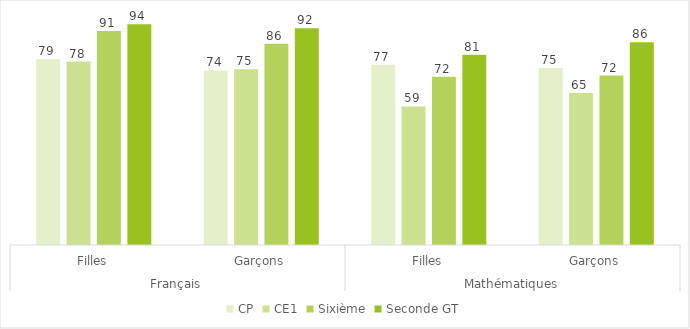
| Category | CP | CE1 | Sixième | Seconde GT |
|---|---|---|---|---|
| 0 | 79.086 | 78.06 | 91.1 | 93.9 |
| 1 | 74.3 | 74.739 | 85.65 | 92.2 |
| 2 | 76.66 | 58.939 | 71.56 | 81 |
| 3 | 75.337 | 64.699 | 72.1 | 86.3 |